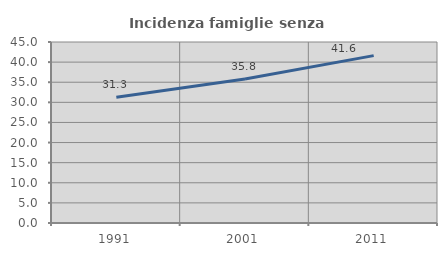
| Category | Incidenza famiglie senza nuclei |
|---|---|
| 1991.0 | 31.268 |
| 2001.0 | 35.778 |
| 2011.0 | 41.617 |